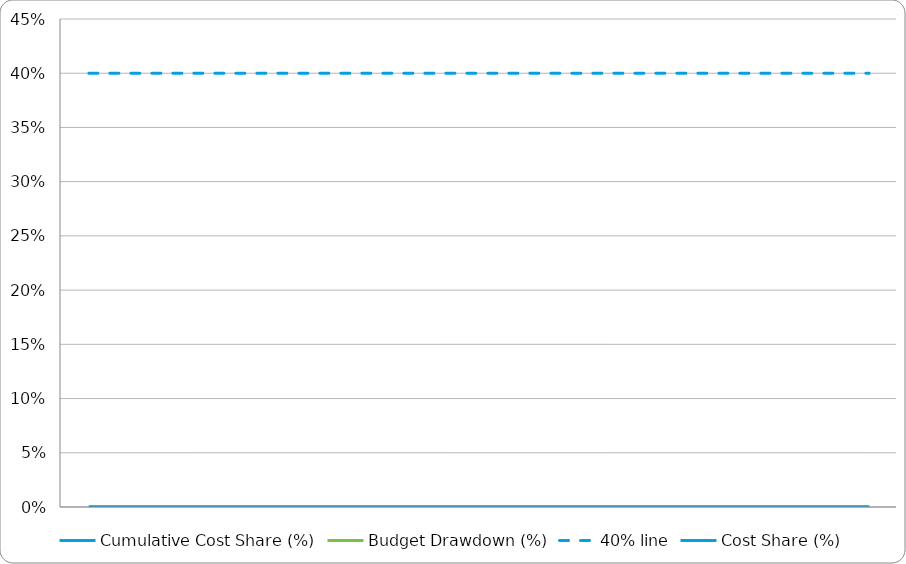
| Category | Cumulative Cost Share (%) | Budget Drawdown (%) | 40% line | Cost Share (%) |
|---|---|---|---|---|
|  | 0 | 0 | 0.4 | 0 |
|  | 0 | 0 | 0.4 | 0 |
|  | 0 | 0 | 0.4 | 0 |
|  | 0 | 0 | 0.4 | 0 |
|  | 0 | 0 | 0.4 | 0 |
|  | 0 | 0 | 0.4 | 0 |
|  | 0 | 0 | 0.4 | 0 |
|  | 0 | 0 | 0.4 | 0 |
|  | 0 | 0 | 0.4 | 0 |
|  | 0 | 0 | 0.4 | 0 |
|  | 0 | 0 | 0.4 | 0 |
|  | 0 | 0 | 0.4 | 0 |
|  | 0 | 0 | 0.4 | 0 |
|  | 0 | 0 | 0.4 | 0 |
|  | 0 | 0 | 0.4 | 0 |